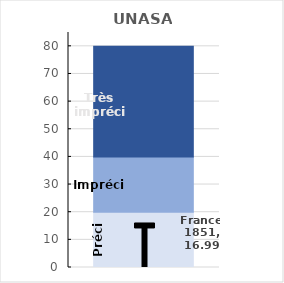
| Category | Précis | Imprécis | Très imprécis |
|---|---|---|---|
| UNASAI | 20 | 20 | 40 |